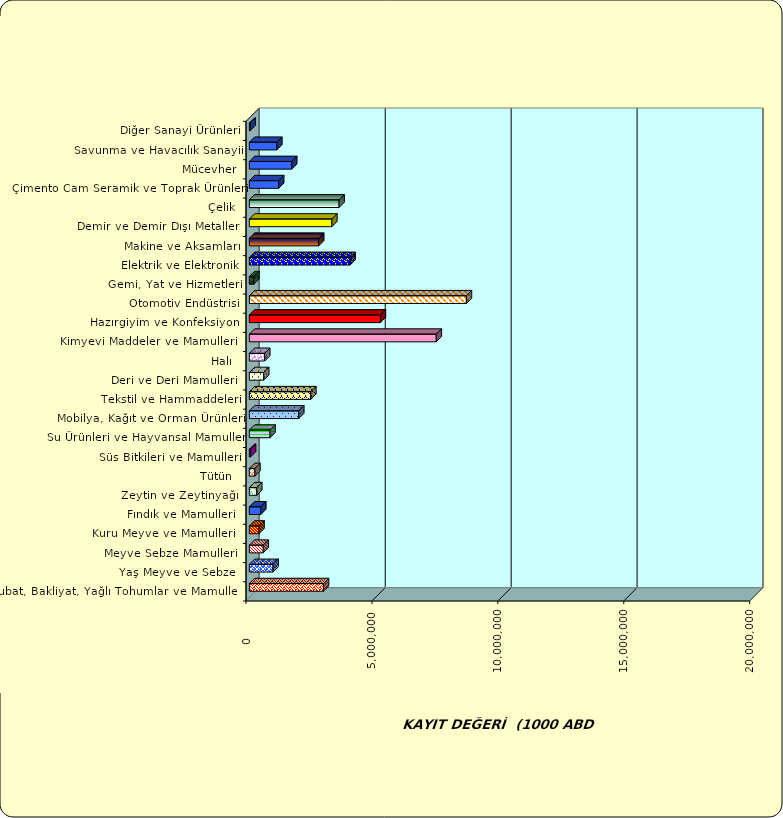
| Category | Series 0 |
|---|---|
|  Hububat, Bakliyat, Yağlı Tohumlar ve Mamulleri  | 2944487.13 |
|  Yaş Meyve ve Sebze   | 941523.654 |
|  Meyve Sebze Mamulleri  | 551003.914 |
|  Kuru Meyve ve Mamulleri   | 384283.316 |
|  Fındık ve Mamulleri  | 454957.563 |
|  Zeytin ve Zeytinyağı  | 294754.076 |
|  Tütün  | 222101.899 |
|  Süs Bitkileri ve Mamulleri | 48451.808 |
|  Su Ürünleri ve Hayvansal Mamuller | 821822.99 |
|  Mobilya, Kağıt ve Orman Ürünleri | 1962740.297 |
|  Tekstil ve Hammaddeleri | 2440846.15 |
|  Deri ve Deri Mamulleri  | 570418.21 |
|  Halı  | 610697.37 |
|  Kimyevi Maddeler ve Mamulleri   | 7422256.865 |
|  Hazırgiyim ve Konfeksiyon  | 5204327.839 |
|  Otomotiv Endüstrisi | 8619158.359 |
|  Gemi, Yat ve Hizmetleri | 178177.924 |
|  Elektrik ve Elektronik | 4000339.445 |
|  Makine ve Aksamları | 2752968.612 |
|  Demir ve Demir Dışı Metaller  | 3275758.473 |
|  Çelik | 3563791.76 |
|  Çimento Cam Seramik ve Toprak Ürünleri | 1164388.846 |
|  Mücevher | 1683902.978 |
|  Savunma ve Havacılık Sanayii | 1090513.07 |
|  Diğer Sanayi Ürünleri | 33061.134 |